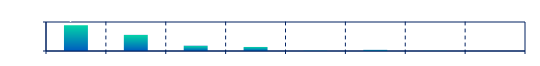
| Category | Series 0 |
|---|---|
|  | 44402 |
|  | 27768 |
|  | 9061 |
|  | 6952 |
|  | 558 |
|  | 1981 |
|  | 302 |
|  | 13 |